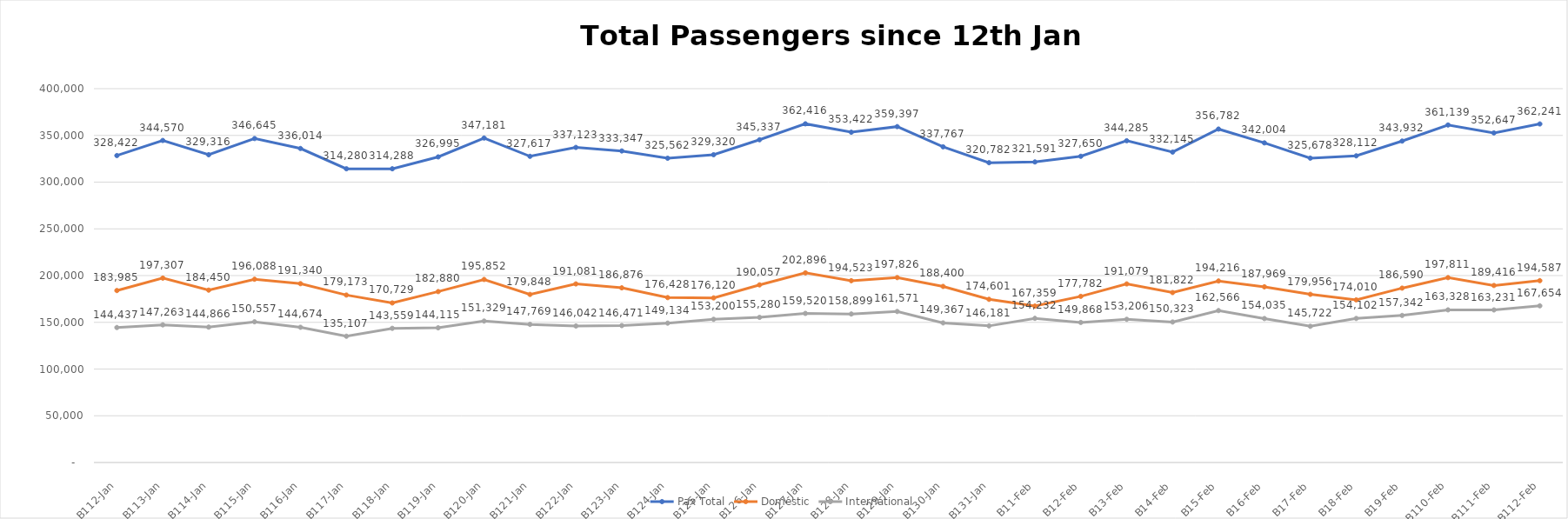
| Category | Pax Total |  Domestic  |  International  |
|---|---|---|---|
| 2023-01-12 | 328422 | 183985 | 144437 |
| 2023-01-13 | 344570 | 197307 | 147263 |
| 2023-01-14 | 329316 | 184450 | 144866 |
| 2023-01-15 | 346645 | 196088 | 150557 |
| 2023-01-16 | 336014 | 191340 | 144674 |
| 2023-01-17 | 314280 | 179173 | 135107 |
| 2023-01-18 | 314288 | 170729 | 143559 |
| 2023-01-19 | 326995 | 182880 | 144115 |
| 2023-01-20 | 347181 | 195852 | 151329 |
| 2023-01-21 | 327617 | 179848 | 147769 |
| 2023-01-22 | 337123 | 191081 | 146042 |
| 2023-01-23 | 333347 | 186876 | 146471 |
| 2023-01-24 | 325562 | 176428 | 149134 |
| 2023-01-25 | 329320 | 176120 | 153200 |
| 2023-01-26 | 345337 | 190057 | 155280 |
| 2023-01-27 | 362416 | 202896 | 159520 |
| 2023-01-28 | 353422 | 194523 | 158899 |
| 2023-01-29 | 359397 | 197826 | 161571 |
| 2023-01-30 | 337767 | 188400 | 149367 |
| 2023-01-31 | 320782 | 174601 | 146181 |
| 2023-02-01 | 321591 | 167359 | 154232 |
| 2023-02-02 | 327650 | 177782 | 149868 |
| 2023-02-03 | 344285 | 191079 | 153206 |
| 2023-02-04 | 332145 | 181822 | 150323 |
| 2023-02-05 | 356782 | 194216 | 162566 |
| 2023-02-06 | 342004 | 187969 | 154035 |
| 2023-02-07 | 325678 | 179956 | 145722 |
| 2023-02-08 | 328112 | 174010 | 154102 |
| 2023-02-09 | 343932 | 186590 | 157342 |
| 2023-02-10 | 361139 | 197811 | 163328 |
| 2023-02-11 | 352647 | 189416 | 163231 |
| 2023-02-12 | 362241 | 194587 | 167654 |